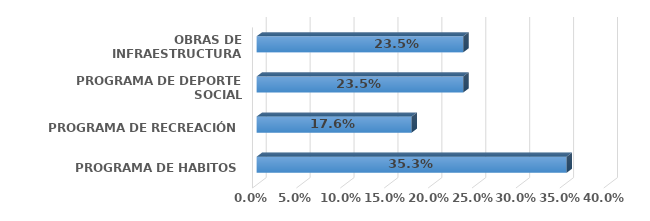
| Category | Series 0 |
|---|---|
| PROGRAMA DE HABITOS | 0.353 |
| PROGRAMA DE RECREACIÓN | 0.176 |
| PROGRAMA DE DEPORTE SOCIAL | 0.235 |
| OBRAS DE INFRAESTRUCTURA DEPORTIVA | 0.235 |